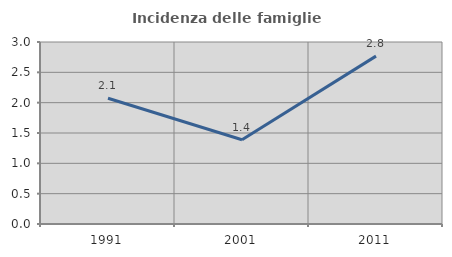
| Category | Incidenza delle famiglie numerose |
|---|---|
| 1991.0 | 2.073 |
| 2001.0 | 1.389 |
| 2011.0 | 2.767 |